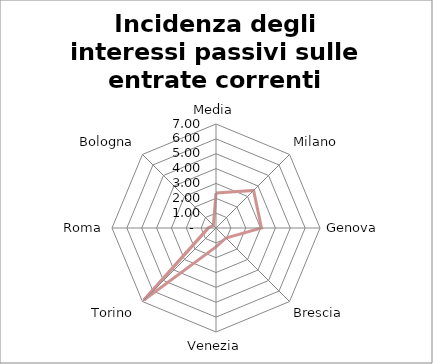
| Category | Incidenza degli interessi passivi sulle entrate correnti |
|---|---|
| Media | 2.356 |
| Milano | 3.58 |
| Genova | 3.06 |
| Brescia | 0.95 |
| Venezia | 1.27 |
| Torino | 6.86 |
| Roma | 0.52 |
| Bologna | 0.25 |